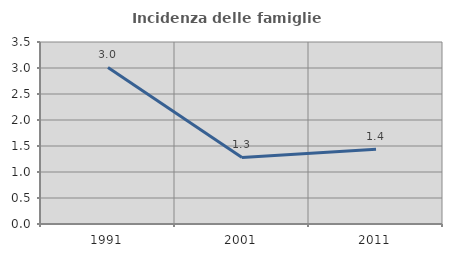
| Category | Incidenza delle famiglie numerose |
|---|---|
| 1991.0 | 3.011 |
| 2001.0 | 1.28 |
| 2011.0 | 1.438 |